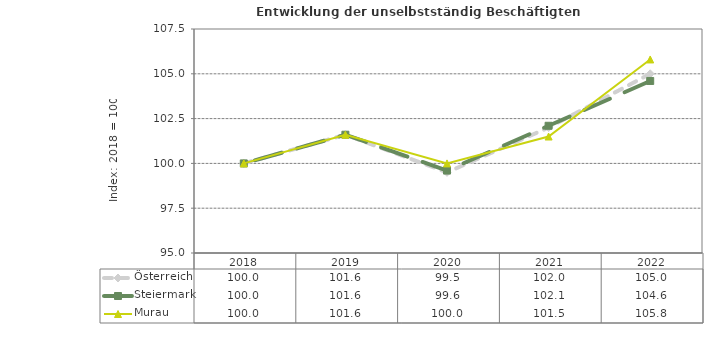
| Category | Österreich | Steiermark | Murau |
|---|---|---|---|
| 2022.0 | 105 | 104.6 | 105.8 |
| 2021.0 | 102 | 102.1 | 101.5 |
| 2020.0 | 99.5 | 99.6 | 100 |
| 2019.0 | 101.6 | 101.6 | 101.6 |
| 2018.0 | 100 | 100 | 100 |